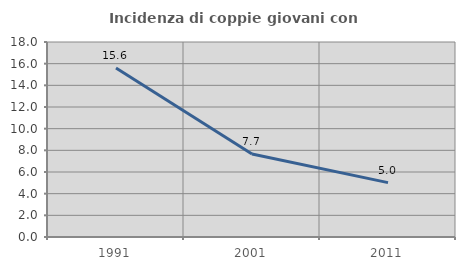
| Category | Incidenza di coppie giovani con figli |
|---|---|
| 1991.0 | 15.596 |
| 2001.0 | 7.661 |
| 2011.0 | 5.018 |